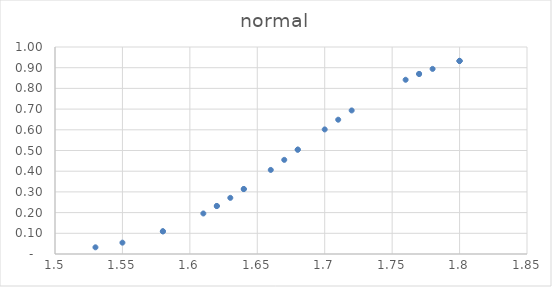
| Category | normal |
|---|---|
| 1.58 | 0.11 |
| 1.62 | 0.232 |
| 1.58 | 0.11 |
| 1.72 | 0.694 |
| 1.53 | 0.032 |
| 1.64 | 0.314 |
| 1.55 | 0.055 |
| 1.76 | 0.842 |
| 1.66 | 0.406 |
| 1.7 | 0.602 |
| 1.63 | 0.271 |
| 1.61 | 0.196 |
| 1.68 | 0.504 |
| 1.67 | 0.455 |
| 1.77 | 0.87 |
| 1.78 | 0.894 |
| 1.77 | 0.87 |
| 1.8 | 0.933 |
| 1.8 | 0.933 |
| 1.8 | 0.933 |
| 1.64 | 0.314 |
| 1.71 | 0.649 |
| 1.62 | 0.232 |
| 1.68 | 0.504 |